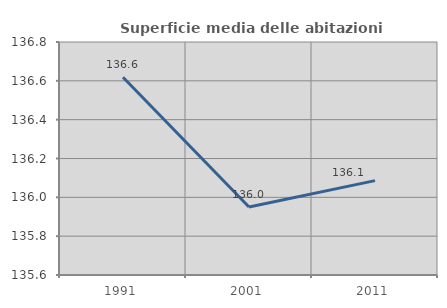
| Category | Superficie media delle abitazioni occupate |
|---|---|
| 1991.0 | 136.618 |
| 2001.0 | 135.95 |
| 2011.0 | 136.086 |